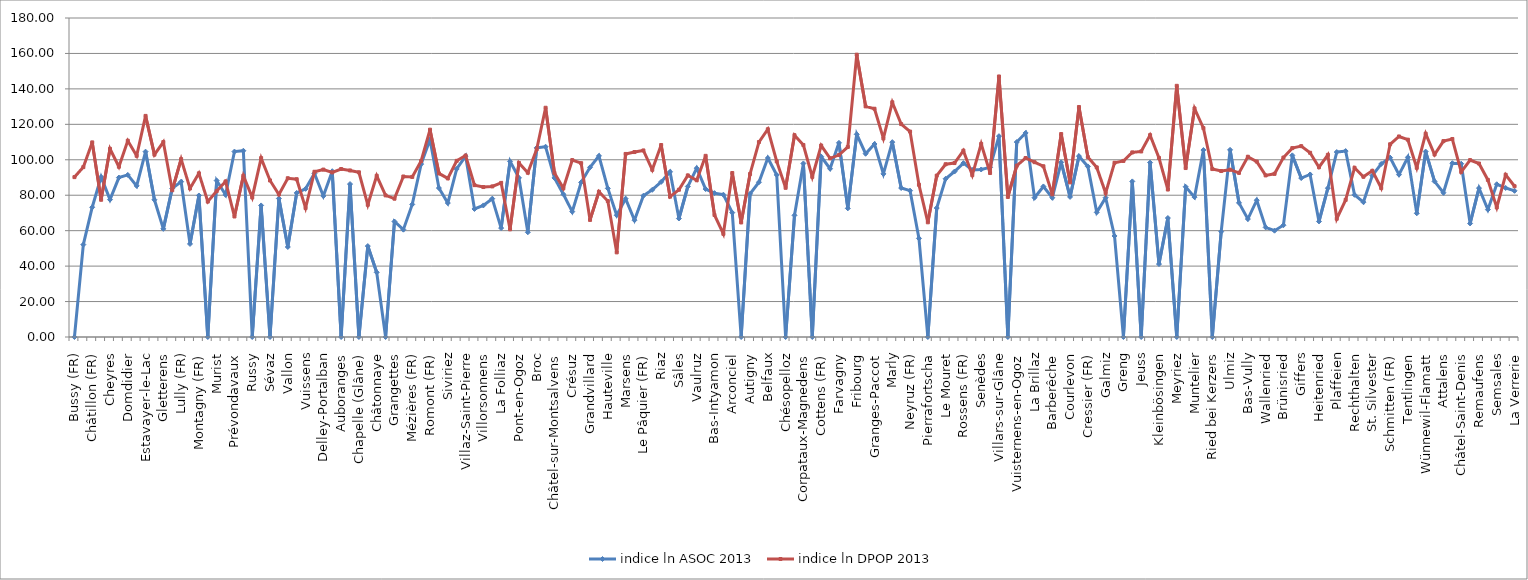
| Category | indice ln ASOC 2013 | indice ln DPOP 2013 |
|---|---|---|
| Bussy (FR) | 0 | 90.212 |
| Châbles | 52.141 | 95.86 |
| Châtillon (FR) | 73.219 | 109.815 |
| Cheiry | 90.334 | 77.433 |
| Cheyres | 77.532 | 106.169 |
| Cugy (FR) | 89.957 | 96.071 |
| Domdidier | 91.456 | 110.746 |
| Dompierre (FR) | 85.268 | 102.234 |
| Estavayer-le-Lac | 104.588 | 124.76 |
| Fétigny | 77.435 | 102.902 |
| Gletterens | 61.021 | 110.003 |
| Léchelles | 83.876 | 82.798 |
| Lully (FR) | 87.641 | 100.389 |
| Ménières | 52.507 | 83.847 |
| Montagny (FR) | 79.856 | 92.352 |
| Morens (FR) | 0 | 76.414 |
| Murist | 88.27 | 82.333 |
| Nuvilly | 80.224 | 87.775 |
| Prévondavaux | 104.638 | 68.004 |
| Rueyres-les-Prés | 105.095 | 90.989 |
| Russy | 0 | 78.752 |
| Saint-Aubin (FR) | 74.24 | 100.952 |
| Sévaz | 0 | 88.346 |
| Surpierre | 78.157 | 80.439 |
| Vallon | 50.792 | 89.585 |
| Villeneuve (FR) | 81.297 | 89.015 |
| Vuissens | 83.596 | 72.79 |
| Les Montets | 92.261 | 93.23 |
| Delley-Portalban | 79.551 | 94.467 |
| Vernay | 93.539 | 92.858 |
| Auboranges | 0 | 94.791 |
| Billens-Hennens | 86.304 | 93.983 |
| Chapelle (Glâne) | 0 | 92.936 |
| Le Châtelard | 51.31 | 74.6 |
| Châtonnaye | 36.493 | 90.96 |
| Ecublens (FR) | 0 | 79.907 |
| Grangettes | 65.172 | 78.056 |
| Massonnens | 60.571 | 90.569 |
| Mézières (FR) | 74.812 | 90.339 |
| Montet (Glâne) | 97.559 | 99.34 |
| Romont (FR) | 111.381 | 116.979 |
| Rue | 84.05 | 92.302 |
| Siviriez | 75.587 | 89.479 |
| Ursy | 94.811 | 99.405 |
| Villaz-Saint-Pierre | 102.062 | 102.385 |
| Vuisternens-devant-Romont | 72.24 | 85.692 |
| Villorsonnens | 74.248 | 84.613 |
| Torny | 78.049 | 84.97 |
| La Folliaz | 61.458 | 86.953 |
| Haut-Intyamon | 99.105 | 60.748 |
| Pont-en-Ogoz | 89.801 | 98.227 |
| Botterens | 59.105 | 92.685 |
| Broc | 106.723 | 105.915 |
| Bulle | 107.37 | 129.352 |
| Châtel-sur-Montsalvens | 89.757 | 92.534 |
| Corbières | 80.557 | 83.943 |
| Crésuz | 70.732 | 99.82 |
| Echarlens | 87.249 | 98.07 |
| Grandvillard | 95.721 | 66.064 |
| Gruyères | 102.195 | 81.964 |
| Hauteville | 83.867 | 76.693 |
| Jaun | 68.695 | 47.743 |
| Marsens | 78.049 | 103.292 |
| Morlon | 65.92 | 104.366 |
| Le Pâquier (FR) | 79.699 | 105.257 |
| Pont-la-Ville | 83.063 | 94.357 |
| Riaz | 87.534 | 108.336 |
| La Roche | 93.204 | 79.181 |
| Sâles | 66.862 | 83.092 |
| Sorens | 84.93 | 91.189 |
| Vaulruz | 95.259 | 88.435 |
| Vuadens | 83.484 | 102.223 |
| Bas-Intyamon | 81.186 | 68.848 |
| Val-de-Charmey | 80.316 | 58.219 |
| Arconciel | 70.184 | 92.526 |
| Autafond | 0 | 64.623 |
| Autigny | 80.782 | 91.996 |
| Avry | 87.333 | 110.017 |
| Belfaux | 100.979 | 117.22 |
| Chénens | 91.445 | 99.082 |
| Chésopelloz | 0 | 84.174 |
| Corminboeuf | 68.67 | 113.862 |
| Corpataux-Magnedens | 97.928 | 108.344 |
| Corserey | 0 | 90.365 |
| Cottens (FR) | 101.819 | 108.035 |
| Ependes (FR) | 94.947 | 100.83 |
| Farvagny | 109.563 | 102.673 |
| Ferpicloz | 72.589 | 107.257 |
| Fribourg | 114.361 | 159.29 |
| Givisiez | 103.432 | 130.135 |
| Granges-Paccot | 108.907 | 128.792 |
| Grolley | 92.044 | 112.071 |
| Marly | 109.946 | 132.438 |
| Matran | 84.066 | 120.14 |
| Neyruz (FR) | 82.571 | 115.903 |
| Noréaz | 55.645 | 85.896 |
| Pierrafortscha | 0 | 64.713 |
| Ponthaux | 72.776 | 91.037 |
| Le Mouret | 89.278 | 97.462 |
| Prez-vers-Noréaz | 93.365 | 98.151 |
| Rossens (FR) | 98.1 | 105.154 |
| Le Glèbe | 94.27 | 91.352 |
| Senèdes | 94.517 | 108.954 |
| Treyvaux | 95.728 | 92.523 |
| Villars-sur-Glâne | 113.32 | 147.015 |
| Villarsel-sur-Marly | 0 | 79.017 |
| Vuisternens-en-Ogoz | 109.998 | 96.647 |
| Hauterive (FR) | 115.145 | 100.992 |
| La Brillaz | 78.594 | 98.647 |
| La Sonnaz | 84.951 | 96.326 |
| Barberêche | 78.589 | 80.501 |
| Courgevaux | 98.524 | 114.519 |
| Courlevon | 79.044 | 87.247 |
| Courtepin | 102.044 | 129.781 |
| Cressier (FR) | 96.239 | 101.526 |
| Fräschels | 70.332 | 95.693 |
| Galmiz | 78.63 | 81.23 |
| Gempenach | 57.001 | 98.311 |
| Greng | 0 | 99.348 |
| Gurmels | 87.802 | 104.166 |
| Jeuss | 0 | 104.691 |
| Kerzers | 98.412 | 113.905 |
| Kleinbösingen | 41.17 | 101.049 |
| Lurtigen | 67.132 | 83.203 |
| Meyriez | 0 | 141.731 |
| Misery-Courtion | 84.78 | 95.341 |
| Muntelier | 78.928 | 128.97 |
| Murten | 105.497 | 117.848 |
| Ried bei Kerzers | 0 | 94.763 |
| Salvenach | 59.441 | 93.65 |
| Ulmiz | 105.598 | 94.414 |
| Villarepos | 75.685 | 92.612 |
| Bas-Vully | 66.558 | 101.713 |
| Haut-Vully | 77.178 | 98.983 |
| Wallenried | 61.856 | 91.178 |
| Alterswil | 59.988 | 92.074 |
| Brünisried | 63.072 | 101.238 |
| Düdingen | 102.496 | 106.578 |
| Giffers | 89.675 | 107.693 |
| Bösingen | 91.704 | 103.954 |
| Heitenried | 65.204 | 95.817 |
| Oberschrot | 83.998 | 102.77 |
| Plaffeien | 104.368 | 66.745 |
| Plasselb | 104.907 | 77.375 |
| Rechthalten | 80.234 | 95.476 |
| St. Antoni | 76.073 | 90.422 |
| St. Silvester | 91.101 | 93.793 |
| St. Ursen | 97.638 | 84.058 |
| Schmitten (FR) | 101.229 | 108.745 |
| Tafers | 91.62 | 113.152 |
| Tentlingen | 101.379 | 111.338 |
| Ueberstorf | 69.807 | 95.478 |
| Wünnewil-Flamatt | 104.622 | 114.706 |
| Zumholz | 87.796 | 102.983 |
| Attalens | 81.403 | 110.522 |
| Bossonnens | 98.07 | 111.725 |
| Châtel-Saint-Denis | 97.782 | 93.13 |
| Granges (Veveyse) | 64.071 | 99.809 |
| Remaufens | 84.007 | 97.88 |
| Saint-Martin (FR) | 71.87 | 88.64 |
| Semsales | 86.191 | 73.084 |
| Le Flon | 84.11 | 91.527 |
| La Verrerie | 82.482 | 85.071 |